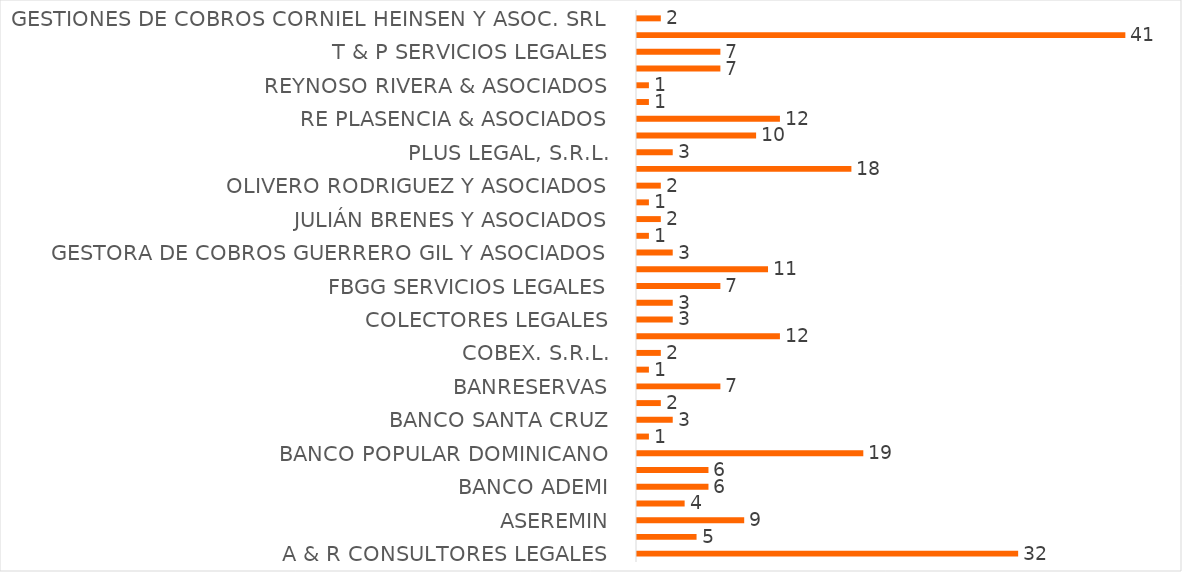
| Category | CANTIDAD DE CASOS |
|---|---|
| A & R CONSULTORES LEGALES | 32 |
| ASC. POPULAR DE AHORROS Y PRESTAMOS | 5 |
| ASEREMIN | 9 |
| BALLISTA CONTRERAS & ASOCIADO | 4 |
| BANCO ADEMI | 6 |
| BANCO CARIBE | 6 |
| BANCO POPULAR DOMINICANO | 19 |
| BANCO PROMERICA | 1 |
| BANCO SANTA CRUZ | 3 |
| BANESCO | 2 |
| BANRESERVAS | 7 |
| CABRAL & DIAZ ASESORES LEGALES | 1 |
| COBEX. S.R.L. | 2 |
| COBROS NACIONALES | 12 |
| COLECTORES LEGALES | 3 |
| ESTUDIO LEGAL SOSA EVERTZ | 3 |
| FBGG SERVICIOS LEGALES | 7 |
| GESTIONADORA DE CRÉDITOS, S. A. | 11 |
| GESTORA DE COBROS GUERRERO GIL Y ASOCIADOS | 3 |
| INVERSIONES 3R | 1 |
| JULIÁN BRENES Y ASOCIADOS | 2 |
| MOYA & ASOCIADO | 1 |
| OLIVERO RODRIGUEZ Y ASOCIADOS | 2 |
| PC&N ACCESO LEGAL | 18 |
| PLUS LEGAL, S.R.L. | 3 |
| PROFESIONALES, S.R.L | 10 |
| RE PLASENCIA & ASOCIADOS | 12 |
| RENASSANCE CONSULTANTS, SRL | 1 |
| REYNOSO RIVERA & ASOCIADOS | 1 |
| SCOTIABANK | 7 |
| T & P SERVICIOS LEGALES | 7 |
| TEMPLARIS COBRANZAS | 41 |
| GESTIONES DE COBROS CORNIEL HEINSEN Y ASOC. SRL | 2 |